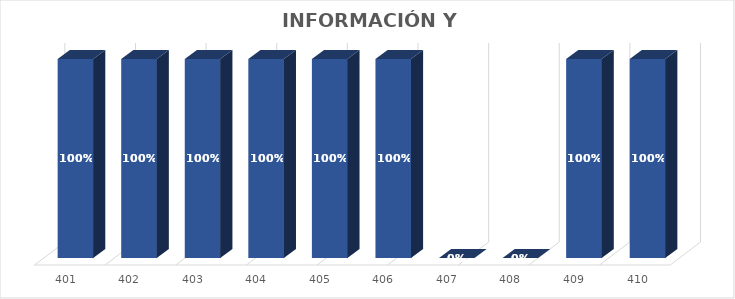
| Category | % Avance |
|---|---|
| 401.0 | 1 |
| 402.0 | 1 |
| 403.0 | 1 |
| 404.0 | 1 |
| 405.0 | 1 |
| 406.0 | 1 |
| 407.0 | 0 |
| 408.0 | 0 |
| 409.0 | 1 |
| 410.0 | 1 |